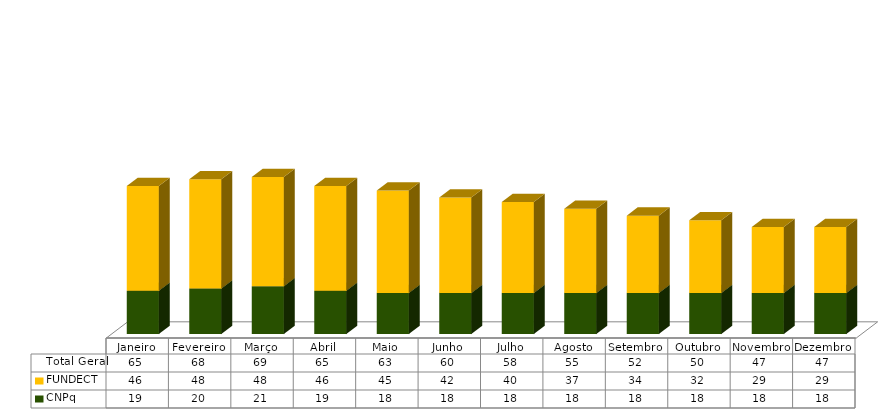
| Category | CNPq | FUNDECT | Total Geral |
|---|---|---|---|
| Janeiro | 19 | 46 | 65 |
| Fevereiro | 20 | 48 | 68 |
| Março | 21 | 48 | 69 |
| Abril | 19 | 46 | 65 |
| Maio | 18 | 45 | 63 |
| Junho | 18 | 42 | 60 |
| Julho | 18 | 40 | 58 |
| Agosto | 18 | 37 | 55 |
| Setembro | 18 | 34 | 52 |
| Outubro | 18 | 32 | 50 |
| Novembro | 18 | 29 | 47 |
| Dezembro | 18 | 29 | 47 |